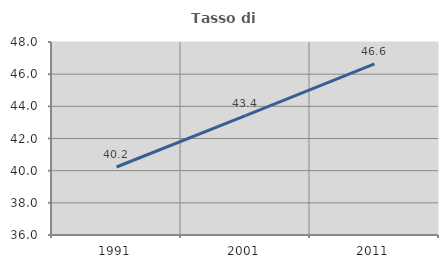
| Category | Tasso di occupazione   |
|---|---|
| 1991.0 | 40.228 |
| 2001.0 | 43.423 |
| 2011.0 | 46.641 |